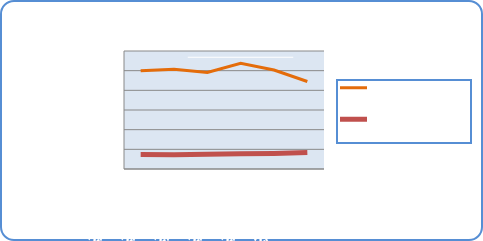
| Category | Motorin Türleri  | Benzin Türleri |
|---|---|---|
| 2/5/18 | 49968189.389 | 7312504.864 |
| 2/6/18 | 50758698.19 | 7262760.157 |
| 2/7/18 | 49073327.329 | 7484950.009 |
| 2/8/18 | 53733267.457 | 7752626.769 |
| 2/9/18 | 50304652.718 | 7901801.683 |
| 2/10/18 | 44489015.818 | 8375956.135 |